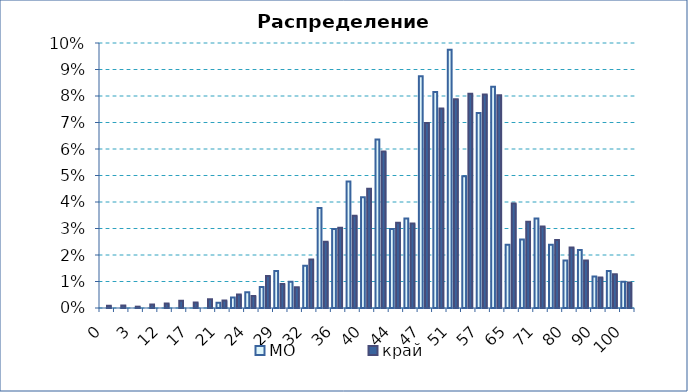
| Category | МО | край |
|---|---|---|
| 0.0 | 0 | 0.001 |
| 2.0 | 0 | 0.001 |
| 3.0 | 0 | 0.001 |
| 9.0 | 0 | 0.001 |
| 12.0 | 0 | 0.002 |
| 15.0 | 0 | 0.003 |
| 17.0 | 0 | 0.002 |
| 20.0 | 0 | 0.003 |
| 21.0 | 0.002 | 0.003 |
| 23.0 | 0.004 | 0.005 |
| 24.0 | 0.006 | 0.005 |
| 27.0 | 0.008 | 0.012 |
| 29.0 | 0.014 | 0.009 |
| 30.0 | 0.01 | 0.008 |
| 32.0 | 0.016 | 0.018 |
| 34.0 | 0.038 | 0.025 |
| 36.0 | 0.03 | 0.03 |
| 38.0 | 0.048 | 0.035 |
| 40.0 | 0.042 | 0.045 |
| 42.0 | 0.064 | 0.059 |
| 44.0 | 0.03 | 0.032 |
| 45.0 | 0.034 | 0.032 |
| 47.0 | 0.087 | 0.07 |
| 49.0 | 0.082 | 0.075 |
| 51.0 | 0.097 | 0.079 |
| 54.0 | 0.05 | 0.081 |
| 57.0 | 0.074 | 0.081 |
| 61.0 | 0.083 | 0.08 |
| 65.0 | 0.024 | 0.039 |
| 66.0 | 0.026 | 0.033 |
| 71.0 | 0.034 | 0.031 |
| 73.0 | 0.024 | 0.026 |
| 80.0 | 0.018 | 0.023 |
| 84.0 | 0.022 | 0.018 |
| 90.0 | 0.012 | 0.012 |
| 93.0 | 0.014 | 0.013 |
| 100.0 | 0.01 | 0.01 |